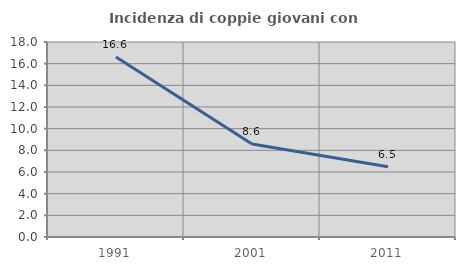
| Category | Incidenza di coppie giovani con figli |
|---|---|
| 1991.0 | 16.611 |
| 2001.0 | 8.576 |
| 2011.0 | 6.485 |